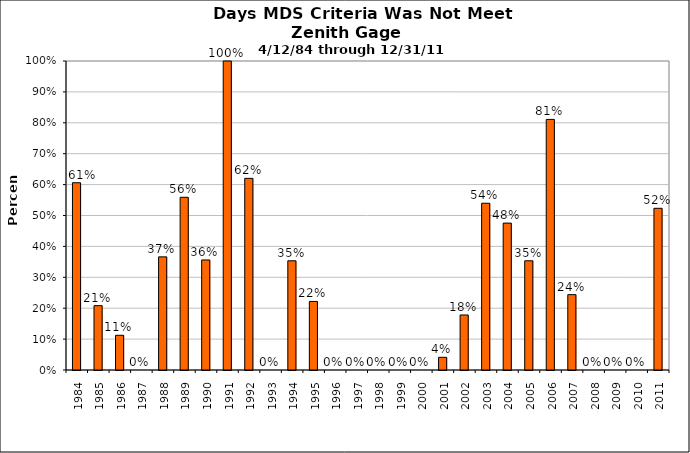
| Category | Zenith |
|---|---|
| 1984.0 | 0.606 |
| 1985.0 | 0.208 |
| 1986.0 | 0.112 |
| 1987.0 | 0 |
| 1988.0 | 0.366 |
| 1989.0 | 0.559 |
| 1990.0 | 0.356 |
| 1991.0 | 1 |
| 1992.0 | 0.62 |
| 1993.0 | 0 |
| 1994.0 | 0.353 |
| 1995.0 | 0.222 |
| 1996.0 | 0 |
| 1997.0 | 0 |
| 1998.0 | 0 |
| 1999.0 | 0 |
| 2000.0 | 0 |
| 2001.0 | 0.041 |
| 2002.0 | 0.178 |
| 2003.0 | 0.54 |
| 2004.0 | 0.475 |
| 2005.0 | 0.353 |
| 2006.0 | 0.811 |
| 2007.0 | 0.244 |
| 2008.0 | 0 |
| 2009.0 | 0 |
| 2010.0 | 0 |
| 2011.0 | 0.523 |